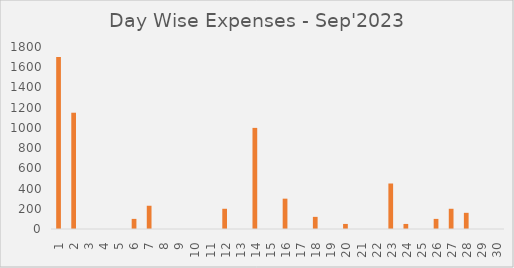
| Category | Expenses |
|---|---|
| 1.0 | 1700 |
| 2.0 | 1150 |
| 3.0 | 0 |
| 4.0 | 0 |
| 5.0 | 0 |
| 6.0 | 100 |
| 7.0 | 230 |
| 8.0 | 0 |
| 9.0 | 0 |
| 10.0 | 0 |
| 11.0 | 0 |
| 12.0 | 200 |
| 13.0 | 0 |
| 14.0 | 1000 |
| 15.0 | 0 |
| 16.0 | 300 |
| 17.0 | 0 |
| 18.0 | 120 |
| 19.0 | 0 |
| 20.0 | 50 |
| 21.0 | 0 |
| 22.0 | 0 |
| 23.0 | 450 |
| 24.0 | 50 |
| 25.0 | 0 |
| 26.0 | 100 |
| 27.0 | 200 |
| 28.0 | 160 |
| 29.0 | 0 |
| 30.0 | 0 |